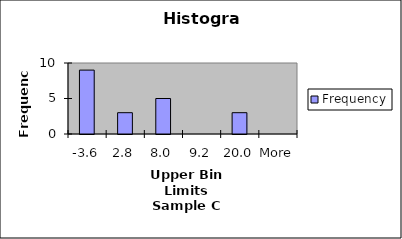
| Category | Frequency |
|---|---|
| -3.6 | 9 |
| 2.8 | 3 |
| 8.0 | 5 |
| 9.2 | 0 |
| 20.0 | 3 |
| More | 0 |